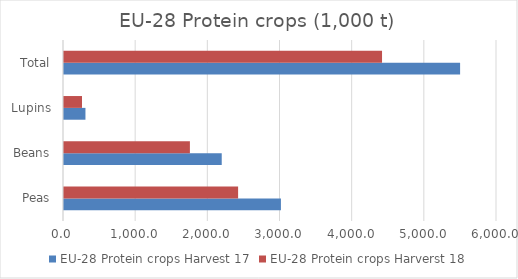
| Category | EU-28 Protein crops |
|---|---|
| Peas | 2412.555 |
| Beans | 1744.601 |
| Lupins | 249.82 |
| Total | 4406.976 |